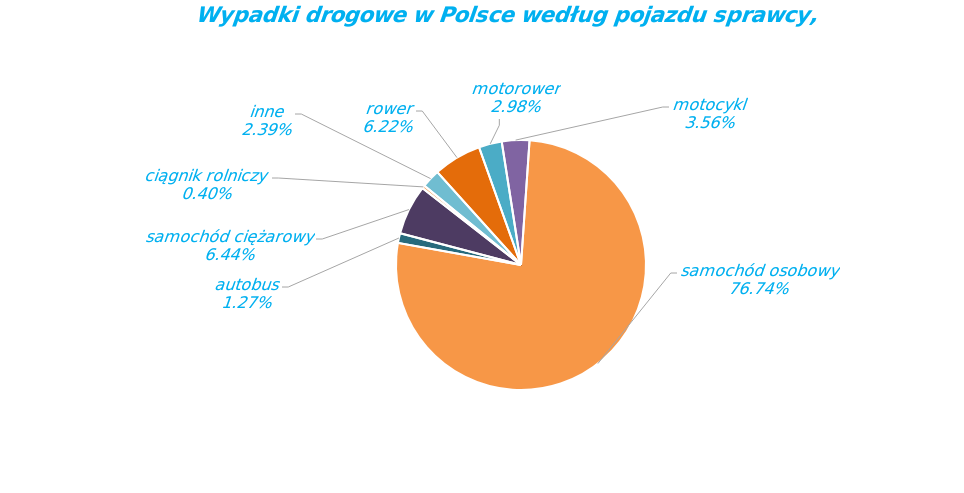
| Category | Series 0 |
|---|---|
| rower | 1786 |
| motorower | 855 |
| motocykl | 1023 |
| samochód osobowy | 22036 |
| autobus | 364 |
| samochód ciężarowy | 1850 |
| ciągnik rolniczy | 115 |
| inne | 687 |